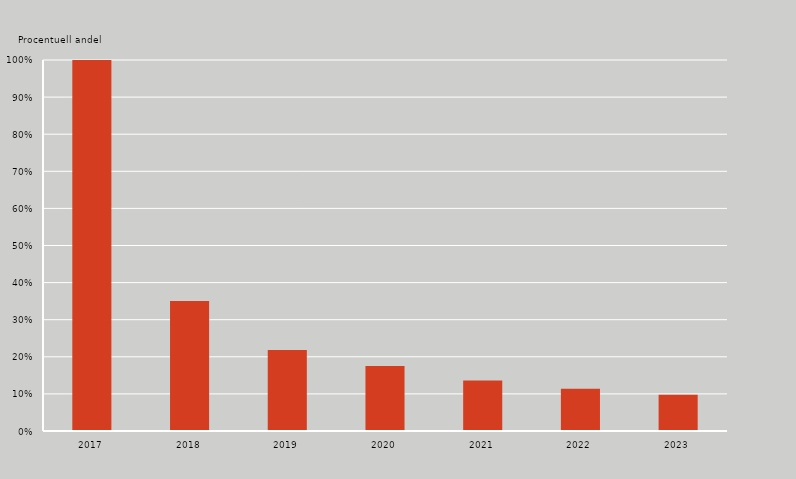
| Category | Series 0 |
|---|---|
| 2017.0 | 1 |
| 2018.0 | 0.351 |
| 2019.0 | 0.218 |
| 2020.0 | 0.175 |
| 2021.0 | 0.136 |
| 2022.0 | 0.114 |
| 2023.0 | 0.098 |